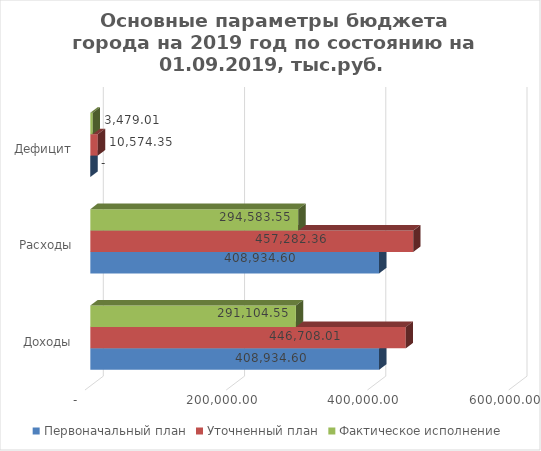
| Category | Первоначальный план | Уточненный план | Фактическое исполнение |
|---|---|---|---|
| Доходы | 408934.598 | 446708.013 | 291104.545 |
| Расходы | 408934.598 | 457282.361 | 294583.553 |
| Дефицит | 0 | 10574.348 | 3479.008 |